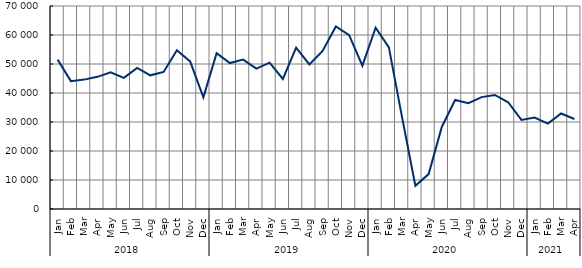
| Category | Series 1 |
|---|---|
| 0 | 51515 |
| 1 | 44095 |
| 2 | 44615 |
| 3 | 45570 |
| 4 | 47100 |
| 5 | 45235 |
| 6 | 48675 |
| 7 | 46100 |
| 8 | 47260 |
| 9 | 54745 |
| 10 | 50895 |
| 11 | 38530 |
| 12 | 53750 |
| 13 | 50330 |
| 14 | 51500 |
| 15 | 48415 |
| 16 | 50480 |
| 17 | 44840 |
| 18 | 55620 |
| 19 | 49850 |
| 20 | 54485 |
| 21 | 62945 |
| 22 | 59930 |
| 23 | 49430 |
| 24 | 62515 |
| 25 | 55735 |
| 26 | 31490 |
| 27 | 8005 |
| 28 | 12030 |
| 29 | 28375 |
| 30 | 37585 |
| 31 | 36465 |
| 32 | 38575 |
| 33 | 39325 |
| 34 | 36810 |
| 35 | 30710 |
| 36 | 31542.5 |
| 37 | 29460 |
| 38 | 32940 |
| 39 | 31050 |